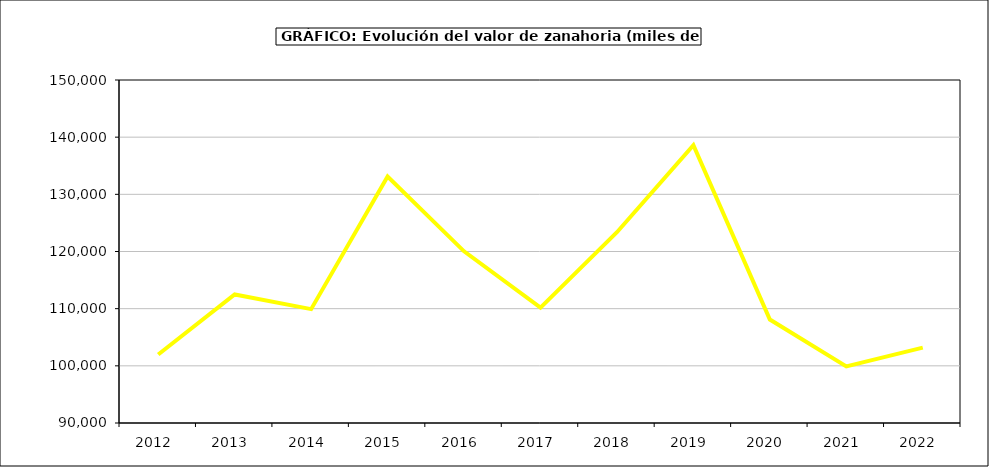
| Category | Valor |
|---|---|
| 2012.0 | 101980.864 |
| 2013.0 | 112485.085 |
| 2014.0 | 109919.203 |
| 2015.0 | 133120 |
| 2016.0 | 120031 |
| 2017.0 | 110169.914 |
| 2018.0 | 123370.95 |
| 2019.0 | 138615.206 |
| 2020.0 | 108091.405 |
| 2021.0 | 99893.158 |
| 2022.0 | 103183.262 |